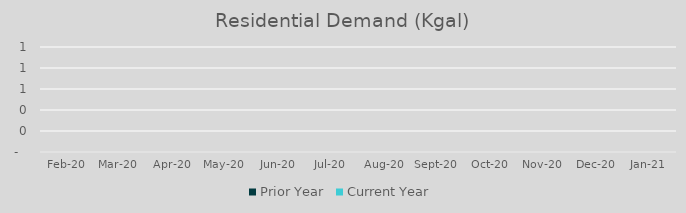
| Category | Prior Year | Current Year |
|---|---|---|
| 43862.0 | 0 | 0 |
| 43891.0 | 0 | 0 |
| 43922.0 | 0 | 0 |
| 43952.0 | 0 | 0 |
| 43983.0 | 0 | 0 |
| 44013.0 | 0 | 0 |
| 44044.0 | 0 | 0 |
| 44075.0 | 0 | 0 |
| 44105.0 | 0 | 0 |
| 44136.0 | 0 | 0 |
| 44166.0 | 0 | 0 |
| 44197.0 | 0 | 0 |